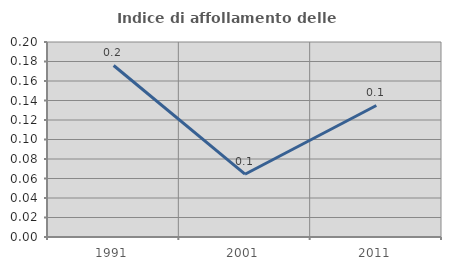
| Category | Indice di affollamento delle abitazioni  |
|---|---|
| 1991.0 | 0.176 |
| 2001.0 | 0.064 |
| 2011.0 | 0.135 |